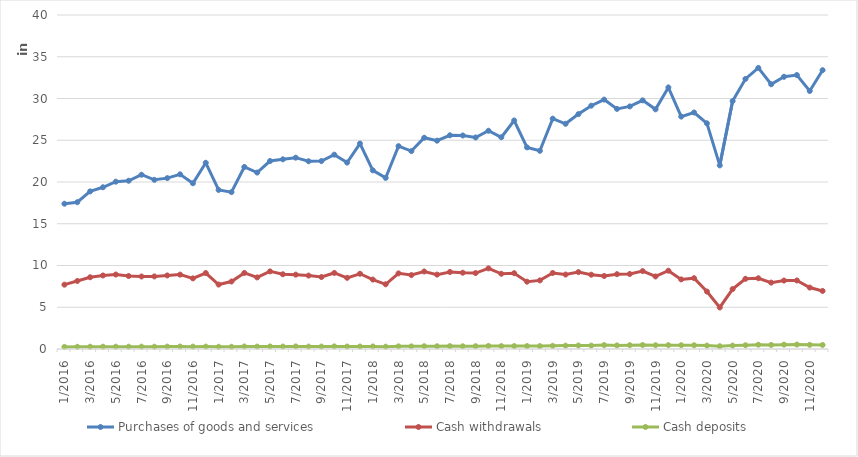
| Category | Purchases of goods and services | Cash withdrawals | Cash deposits |
|---|---|---|---|
| 1/2016 | 17398064 | 7705887 | 250979 |
| 2/2016 | 17577786 | 8146928 | 259555 |
| 3/2016 | 18875299 | 8593920 | 272696 |
| 4/2016 | 19369964 | 8804418 | 277496 |
| 5/2016 | 20037862 | 8919523 | 278601 |
| 6/2016 | 20150390 | 8741649 | 277426 |
| 7/2016 | 20870879 | 8683541 | 283583 |
| 8/2016 | 20259924 | 8691419 | 271392 |
| 9/2016 | 20465635 | 8807988 | 288102 |
| 10/2016 | 20920878 | 8907964 | 295858 |
| 11/2016 | 19849686 | 8457454 | 283318 |
| 12/2016 | 22297704 | 9100521 | 288992 |
| 1/2017 | 19049740 | 7716439 | 265475 |
| 2/2017 | 18785910 | 8081647 | 265311 |
| 3/2017 | 21801248 | 9107151 | 302879 |
| 4/2017 | 21129812 | 8571202 | 288079 |
| 5/2017 | 22511452 | 9294160 | 306151 |
| 6/2017 | 22715590 | 8951156 | 296174 |
| 7/2017 | 22914007 | 8905597 | 308473 |
| 8/2017 | 22481726 | 8794295 | 287793 |
| 9/2017 | 22509349 | 8620457 | 292598 |
| 10/2017 | 23273782 | 9107770 | 314282 |
| 11/2017 | 22326676 | 8521273 | 297593 |
| 12/2017 | 24603928 | 9011798 | 298450 |
| 1/2018 | 21396290 | 8314259 | 305732 |
| 2/2018 | 20491901 | 7749190 | 278411 |
| 3/2018 | 24296065 | 9056018 | 316824 |
| 4/2018 | 23700086 | 8856107 | 314520 |
| 5/2018 | 25302064 | 9282489 | 334814 |
| 6/2018 | 24948705 | 8910680 | 327731 |
| 7/2018 | 25594455 | 9224908 | 345087 |
| 8/2018 | 25571707 | 9136840 | 326566 |
| 9/2018 | 25329990 | 9093823 | 337978 |
| 10/2018 | 26139693 | 9657377 | 370965 |
| 11/2018 | 25358722 | 9011008 | 349382 |
| 12/2018 | 27366263 | 9079602 | 351122 |
| 1/2019 | 24146356 | 8064158 | 350414 |
| 2/2019 | 23738333 | 8215912 | 346721 |
| 3/2019 | 27590008 | 9105578 | 381640 |
| 4/2019 | 26971169 | 8915705 | 404555 |
| 5/2019 | 28133460 | 9207026 | 418371 |
| 6/2019 | 29138551 | 8897073 | 406867 |
| 7/2019 | 29867201 | 8744389 | 467229 |
| 8/2019 | 28755040 | 8960968 | 432139 |
| 9/2019 | 29050955 | 8985078 | 458365 |
| 10/2019 | 29778371 | 9328480 | 476692 |
| 11/2019 | 28702400 | 8686035 | 449473 |
| 12/2019 | 31322325 | 9376124 | 460961 |
| 1/2020 | 27832713 | 8332368 | 450878 |
| 2/2020 | 28324162 | 8482987 | 447770 |
| 3/2020 | 27028800 | 6881927 | 410766 |
| 4/2020 | 21988750 | 4973853 | 335862 |
| 5/2020 | 29693146 | 7174272 | 409903 |
| 6/2020 | 32350132 | 8407235 | 452594 |
| 7/2020 | 33663077 | 8474647 | 513578 |
| 8/2020 | 31706352 | 7950573 | 486042 |
| 9/2020 | 32599708 | 8196347 | 523384 |
| 10/2020 | 32809206 | 8206682 | 531971 |
| 11/2020 | 30900514 | 7356371 | 499213 |
| 12/2020 | 33392978 | 6952764 | 482220 |